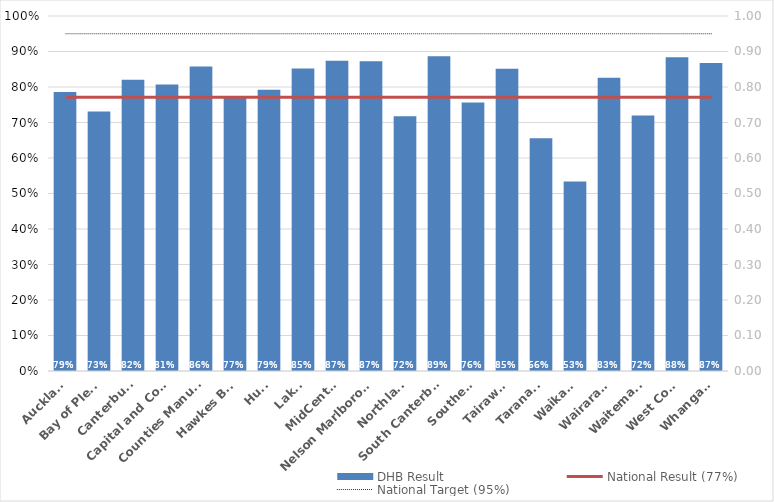
| Category | DHB Result |
|---|---|
| Auckland | 0.786 |
| Bay of Plenty | 0.731 |
| Canterbury | 0.82 |
| Capital and Coast | 0.807 |
| Counties Manukau | 0.857 |
| Hawkes Bay | 0.773 |
| Hutt | 0.792 |
| Lakes | 0.852 |
| MidCentral | 0.874 |
| Nelson Marlborough | 0.873 |
| Northland | 0.718 |
| South Canterbury | 0.887 |
| Southern | 0.757 |
| Tairawhiti | 0.852 |
| Taranaki | 0.656 |
| Waikato | 0.534 |
| Wairarapa | 0.826 |
| Waitemata | 0.72 |
| West Coast | 0.883 |
| Whanganui | 0.868 |